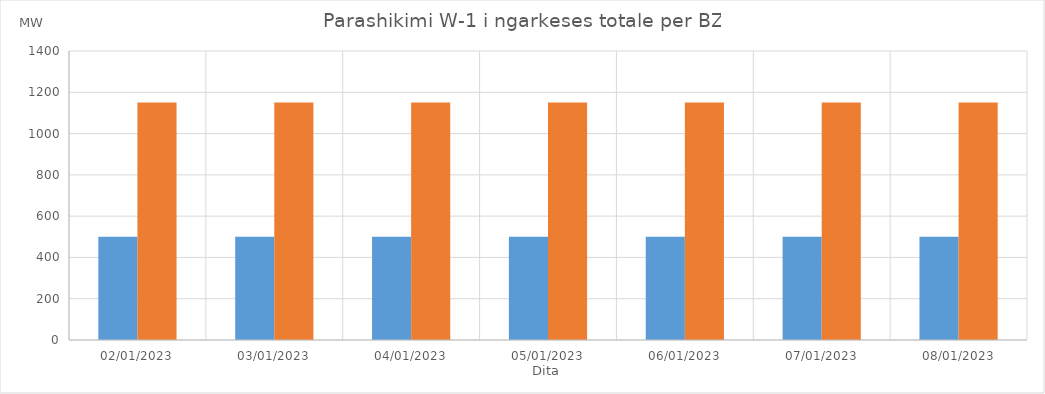
| Category | Min (MW) | Max (MW) |
|---|---|---|
| 02/01/2023 | 500 | 1150 |
| 03/01/2023 | 500 | 1150 |
| 04/01/2023 | 500 | 1150 |
| 05/01/2023 | 500 | 1150 |
| 06/01/2023 | 500 | 1150 |
| 07/01/2023 | 500 | 1150 |
| 08/01/2023 | 500 | 1150 |